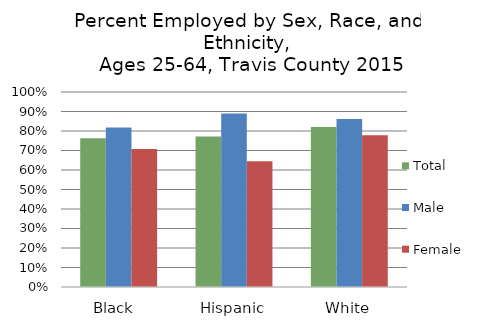
| Category | Total  | Male  | Female |
|---|---|---|---|
| Black  | 0.762 | 0.818 | 0.708 |
| Hispanic | 0.771 | 0.89 | 0.645 |
| White | 0.821 | 0.862 | 0.778 |